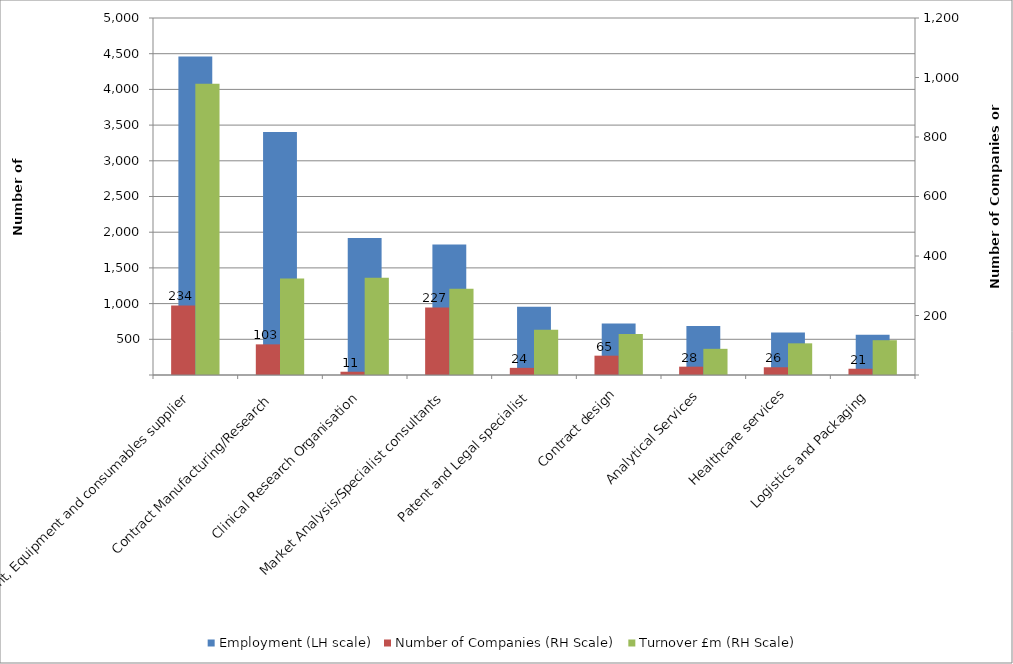
| Category | Employment (LH scale) |
|---|---|
| Reagent, Equipment and consumables supplier | 4462.25 |
| Contract Manufacturing/Research | 3403 |
| Clinical Research Organisation | 1918 |
| Market Analysis/Specialist consultants | 1827.85 |
| Patent and Legal specialist | 956 |
| Contract design | 722 |
| Analytical Services | 686 |
| Healthcare services | 595 |
| Logistics and Packaging | 562 |